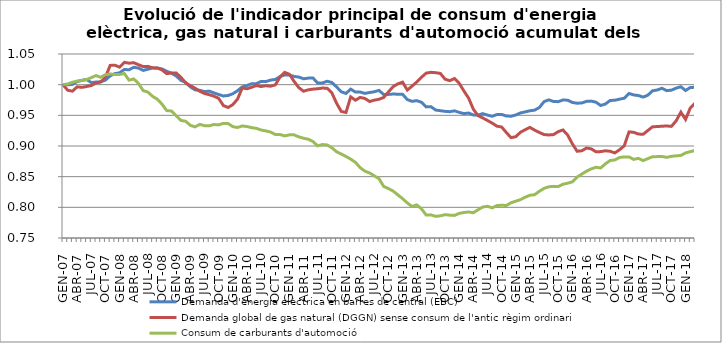
| Category | Demanda d'energia elèctrica en barres de central (EBC) | Demanda global de gas natural (DGGN) sense consum de l'antic règim ordinari | Consum de carburants d'automoció |
|---|---|---|---|
| GEN-07 | 1 | 1 | 1 |
| FEB-07 | 1 | 0.991 | 1.001 |
| MAR-07 | 1 | 0.989 | 1.004 |
| ABR-07 | 1.005 | 0.996 | 1.006 |
| MAI-07 | 1.007 | 0.996 | 1.007 |
| JUN-07 | 1.008 | 0.997 | 1.008 |
| JUL-07 | 1.003 | 0.999 | 1.012 |
| AGO-07 | 1.004 | 1.003 | 1.015 |
| SET-07 | 1.005 | 1.004 | 1.012 |
| OCT-07 | 1.007 | 1.012 | 1.016 |
| NOV-07 | 1.014 | 1.031 | 1.018 |
| DES-07 | 1.018 | 1.032 | 1.017 |
| GEN-08 | 1.019 | 1.029 | 1.017 |
| FEB-08 | 1.025 | 1.036 | 1.018 |
| MAR-08 | 1.024 | 1.035 | 1.007 |
| ABR-08 | 1.028 | 1.036 | 1.009 |
| MAI-08 | 1.027 | 1.033 | 1.002 |
| JUN-08 | 1.023 | 1.029 | 0.99 |
| JUL-08 | 1.025 | 1.03 | 0.988 |
| AGO-08 | 1.027 | 1.027 | 0.981 |
| SET-08 | 1.027 | 1.027 | 0.976 |
| OCT-08 | 1.026 | 1.024 | 0.968 |
| NOV-08 | 1.022 | 1.018 | 0.958 |
| DES-08 | 1.019 | 1.019 | 0.957 |
| GEN-09 | 1.014 | 1.019 | 0.949 |
| FEB-09 | 1.007 | 1.012 | 0.942 |
| MAR-09 | 1.004 | 1.003 | 0.94 |
| ABR-09 | 0.996 | 0.998 | 0.934 |
| MAI-09 | 0.992 | 0.994 | 0.931 |
| JUN-09 | 0.991 | 0.989 | 0.935 |
| JUL-09 | 0.989 | 0.986 | 0.933 |
| AGO-09 | 0.989 | 0.984 | 0.933 |
| SET-09 | 0.987 | 0.981 | 0.935 |
| OCT-09 | 0.984 | 0.978 | 0.934 |
| NOV-09 | 0.982 | 0.966 | 0.937 |
| DES-09 | 0.982 | 0.963 | 0.937 |
| GEN-10 | 0.985 | 0.967 | 0.932 |
| FEB-10 | 0.99 | 0.976 | 0.93 |
| MAR-10 | 0.996 | 0.995 | 0.933 |
| ABR-10 | 0.999 | 0.993 | 0.932 |
| MAI-10 | 1.002 | 0.996 | 0.93 |
| JUN-10 | 1.002 | 0.999 | 0.929 |
| JUL-10 | 1.005 | 0.997 | 0.926 |
| AGO-10 | 1.005 | 0.998 | 0.925 |
| SET-10 | 1.007 | 0.998 | 0.923 |
| OCT-10 | 1.008 | 1 | 0.919 |
| NOV-10 | 1.013 | 1.012 | 0.919 |
| DES-10 | 1.016 | 1.02 | 0.916 |
| GEN-11 | 1.016 | 1.017 | 0.918 |
| FEB-11 | 1.013 | 1.005 | 0.918 |
| MAR-11 | 1.012 | 0.995 | 0.915 |
| ABR-11 | 1.01 | 0.989 | 0.913 |
| MAI-11 | 1.011 | 0.992 | 0.911 |
| JUN-11 | 1.011 | 0.993 | 0.907 |
| JUL-11 | 1.003 | 0.993 | 0.9 |
| AGO-11 | 1.003 | 0.994 | 0.902 |
| SET-11 | 1.006 | 0.994 | 0.902 |
| OCT-11 | 1.004 | 0.987 | 0.897 |
| NOV-11 | 0.996 | 0.97 | 0.891 |
| DES-11 | 0.988 | 0.956 | 0.887 |
| GEN-12 | 0.986 | 0.955 | 0.883 |
| FEB-12 | 0.993 | 0.98 | 0.879 |
| MAR-12 | 0.988 | 0.975 | 0.873 |
| ABR-12 | 0.988 | 0.979 | 0.865 |
| MAI-12 | 0.986 | 0.978 | 0.859 |
| JUN-12 | 0.987 | 0.973 | 0.856 |
| JUL-12 | 0.988 | 0.975 | 0.851 |
| AGO-12 | 0.991 | 0.976 | 0.847 |
| SET-12 | 0.984 | 0.979 | 0.834 |
| OCT-12 | 0.984 | 0.988 | 0.831 |
| NOV-12 | 0.985 | 0.997 | 0.826 |
| DES-12 | 0.984 | 1.001 | 0.82 |
| GEN-13 | 0.984 | 1.004 | 0.814 |
| FEB-13 | 0.976 | 0.991 | 0.807 |
| MAR-13 | 0.973 | 0.998 | 0.801 |
| ABR-13 | 0.974 | 1.004 | 0.804 |
| MAI-13 | 0.971 | 1.012 | 0.798 |
| JUN-13 | 0.964 | 1.019 | 0.787 |
| JUL-13 | 0.964 | 1.02 | 0.788 |
| AGO-13 | 0.959 | 1.02 | 0.785 |
| SET-13 | 0.958 | 1.018 | 0.786 |
| OCT-13 | 0.956 | 1.009 | 0.788 |
| NOV-13 | 0.956 | 1.007 | 0.787 |
| DES-13 | 0.957 | 1.01 | 0.787 |
| GEN-14 | 0.955 | 1.002 | 0.79 |
| FEB-14 | 0.953 | 0.99 | 0.792 |
| MAR-14 | 0.954 | 0.978 | 0.792 |
| ABR-14 | 0.951 | 0.96 | 0.791 |
| MAI-14 | 0.951 | 0.949 | 0.796 |
| JUN-14 | 0.953 | 0.946 | 0.801 |
| JUL-14 | 0.95 | 0.942 | 0.802 |
| AGO-14 | 0.948 | 0.937 | 0.799 |
| SET-14 | 0.951 | 0.932 | 0.803 |
| OCT-14 | 0.951 | 0.931 | 0.803 |
| NOV-14 | 0.949 | 0.922 | 0.803 |
| DES-14 | 0.949 | 0.914 | 0.808 |
| GEN-15 | 0.951 | 0.915 | 0.81 |
| FEB-15 | 0.954 | 0.922 | 0.813 |
| MAR-15 | 0.956 | 0.927 | 0.816 |
| ABR-15 | 0.957 | 0.93 | 0.82 |
| MAI-15 | 0.959 | 0.926 | 0.821 |
| JUN-15 | 0.963 | 0.922 | 0.826 |
| JUL-15 | 0.972 | 0.919 | 0.831 |
| AGO-15 | 0.975 | 0.918 | 0.834 |
| SET-15 | 0.973 | 0.919 | 0.834 |
| OCT-15 | 0.972 | 0.923 | 0.834 |
| NOV-15 | 0.975 | 0.926 | 0.838 |
| DES-15 | 0.975 | 0.918 | 0.839 |
| GEN-16 | 0.971 | 0.904 | 0.842 |
| FEB-16 | 0.97 | 0.891 | 0.849 |
| MAR-16 | 0.97 | 0.892 | 0.854 |
| ABR-16 | 0.973 | 0.897 | 0.859 |
| MAI-16 | 0.973 | 0.895 | 0.863 |
| JUN-16 | 0.971 | 0.89 | 0.865 |
| JUL-16 | 0.966 | 0.891 | 0.864 |
| AGO-16 | 0.968 | 0.892 | 0.871 |
| SET-16 | 0.974 | 0.891 | 0.876 |
| OCT-16 | 0.975 | 0.889 | 0.877 |
| NOV-16 | 0.976 | 0.894 | 0.881 |
| DES-16 | 0.978 | 0.9 | 0.882 |
| GEN-17 | 0.986 | 0.923 | 0.882 |
| FEB-17 | 0.983 | 0.922 | 0.878 |
| MAR-17 | 0.982 | 0.919 | 0.88 |
| ABR-17 | 0.98 | 0.919 | 0.876 |
| MAI-17 | 0.983 | 0.925 | 0.879 |
| JUN-17 | 0.99 | 0.931 | 0.883 |
| JUL-17 | 0.991 | 0.932 | 0.883 |
| AGO-17 | 0.994 | 0.932 | 0.883 |
| SET-17 | 0.99 | 0.933 | 0.881 |
| OCT-17 | 0.991 | 0.932 | 0.883 |
| NOV-17 | 0.994 | 0.941 | 0.884 |
| DES-17 | 0.997 | 0.955 | 0.885 |
| GEN-18 | 0.99 | 0.943 | 0.889 |
| FEB-18 | 0.995 | 0.962 | 0.891 |
| MAR-18 | 0.996 | 0.97 | 0.893 |